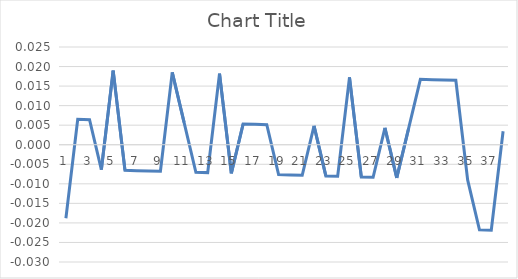
| Category | Series 0 |
|---|---|
| 0 | -0.019 |
| 1 | 0.006 |
| 2 | 0.006 |
| 3 | -0.006 |
| 4 | 0.019 |
| 5 | -0.007 |
| 6 | -0.007 |
| 7 | -0.007 |
| 8 | -0.007 |
| 9 | 0.019 |
| 10 | 0.006 |
| 11 | -0.007 |
| 12 | -0.007 |
| 13 | 0.018 |
| 14 | -0.007 |
| 15 | 0.005 |
| 16 | 0.005 |
| 17 | 0.005 |
| 18 | -0.008 |
| 19 | -0.008 |
| 20 | -0.008 |
| 21 | 0.005 |
| 22 | -0.008 |
| 23 | -0.008 |
| 24 | 0.017 |
| 25 | -0.008 |
| 26 | -0.008 |
| 27 | 0.004 |
| 28 | -0.008 |
| 29 | 0.004 |
| 30 | 0.017 |
| 31 | 0.017 |
| 32 | 0.017 |
| 33 | 0.016 |
| 34 | -0.009 |
| 35 | -0.022 |
| 36 | -0.022 |
| 37 | 0.003 |